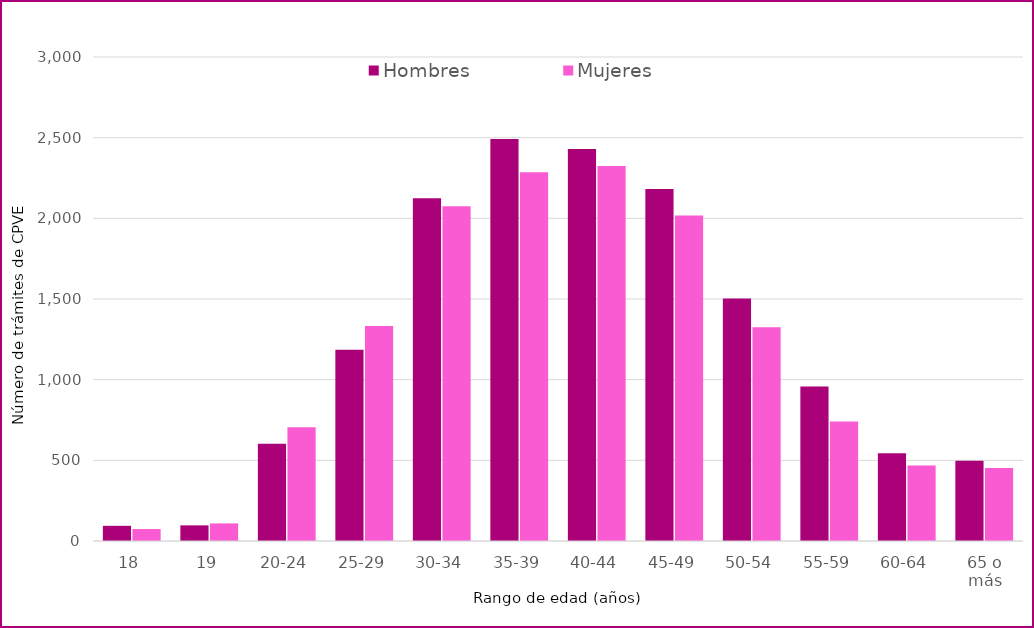
| Category | Hombres | Mujeres |
|---|---|---|
| 18 | 94 | 74 |
| 19 | 97 | 109 |
| 20-24 | 603 | 705 |
| 25-29 | 1185 | 1333 |
| 30-34 | 2124 | 2075 |
| 35-39 | 2491 | 2286 |
| 40-44 | 2430 | 2324 |
| 45-49 | 2182 | 2018 |
| 50-54 | 1503 | 1325 |
| 55-59 | 957 | 740 |
| 60-64 | 544 | 468 |
| 65 o más | 497 | 452 |